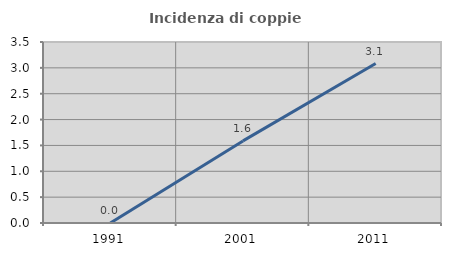
| Category | Incidenza di coppie miste |
|---|---|
| 1991.0 | 0 |
| 2001.0 | 1.587 |
| 2011.0 | 3.084 |